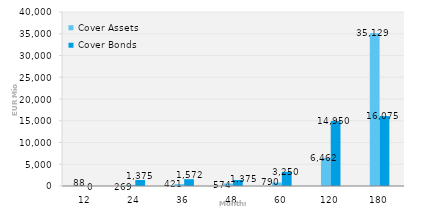
| Category | Cover Assets | Cover Bonds |
|---|---|---|
| 12.0 | 87.729 | 0 |
| 24.0 | 268.965 | 1375 |
| 36.0 | 421.122 | 1572 |
| 48.0 | 573.68 | 1375 |
| 60.0 | 789.755 | 3250 |
| 120.0 | 6461.581 | 14950 |
| 180.0 | 35129.465 | 16075 |